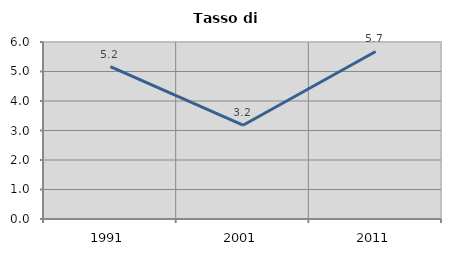
| Category | Tasso di disoccupazione   |
|---|---|
| 1991.0 | 5.168 |
| 2001.0 | 3.179 |
| 2011.0 | 5.679 |